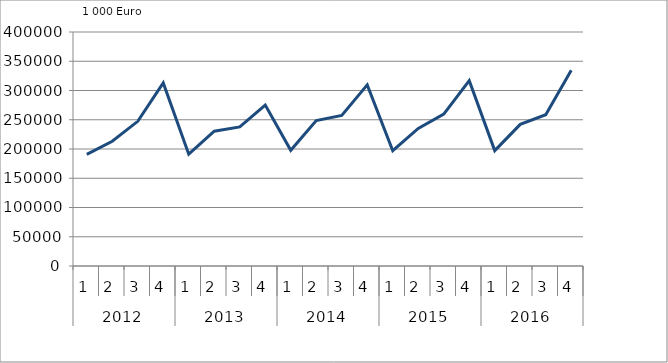
| Category | Ausbaugewerblicher Umsatz3 |
|---|---|
| 0 | 190755 |
| 1 | 213167 |
| 2 | 247277 |
| 3 | 312946 |
| 4 | 191088.978 |
| 5 | 230353.875 |
| 6 | 237735.574 |
| 7 | 275098.219 |
| 8 | 197732.754 |
| 9 | 248690.349 |
| 10 | 257339.084 |
| 11 | 309632.186 |
| 12 | 197030.42 |
| 13 | 235094.994 |
| 14 | 259758.438 |
| 15 | 316833.232 |
| 16 | 197219.532 |
| 17 | 242069.899 |
| 18 | 258547.84 |
| 19 | 334764.305 |